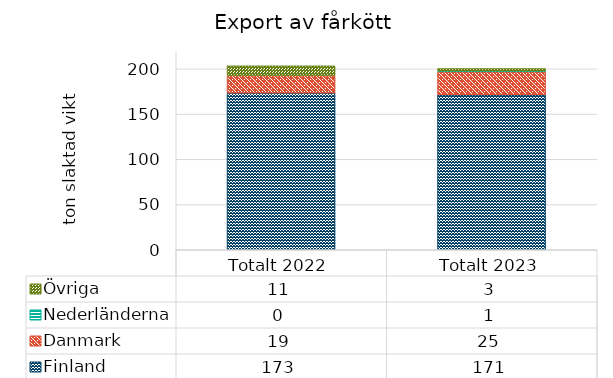
| Category | Finland | Danmark | Nederländerna | Övriga |
|---|---|---|---|---|
| Totalt 2022 | 173.333 | 19.333 | 0 | 10.667 |
| Totalt 2023 | 171.333 | 25.333 | 1 | 2.667 |